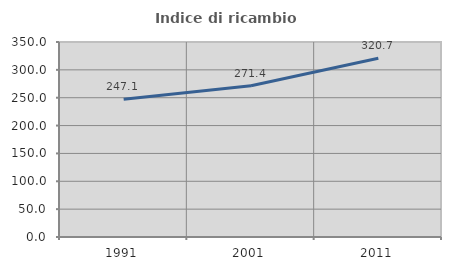
| Category | Indice di ricambio occupazionale  |
|---|---|
| 1991.0 | 247.059 |
| 2001.0 | 271.429 |
| 2011.0 | 320.69 |